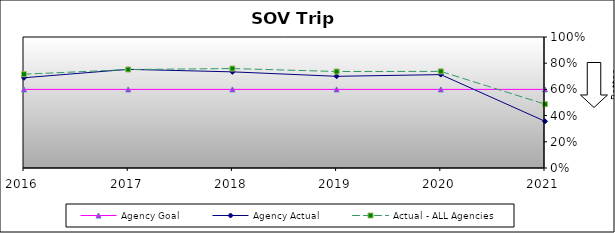
| Category | Agency Goal | Agency Actual | Actual - ALL Agencies |
|---|---|---|---|
| 2016.0 | 0.6 | 0.689 | 0.716 |
| 2017.0 | 0.6 | 0.753 | 0.752 |
| 2018.0 | 0.6 | 0.734 | 0.759 |
| 2019.0 | 0.6 | 0.7 | 0.736 |
| 2020.0 | 0.6 | 0.713 | 0.737 |
| 2021.0 | 0.6 | 0.356 | 0.487 |